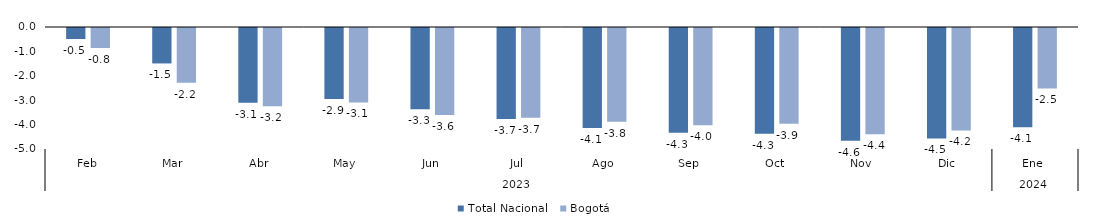
| Category | Total Nacional | Bogotá |
|---|---|---|
| 0 | -0.453 | -0.821 |
| 1 | -1.453 | -2.248 |
| 2 | -3.064 | -3.206 |
| 3 | -2.914 | -3.05 |
| 4 | -3.33 | -3.565 |
| 5 | -3.733 | -3.673 |
| 6 | -4.095 | -3.838 |
| 7 | -4.297 | -3.985 |
| 8 | -4.336 | -3.919 |
| 9 | -4.618 | -4.352 |
| 10 | -4.524 | -4.201 |
| 11 | -4.071 | -2.475 |